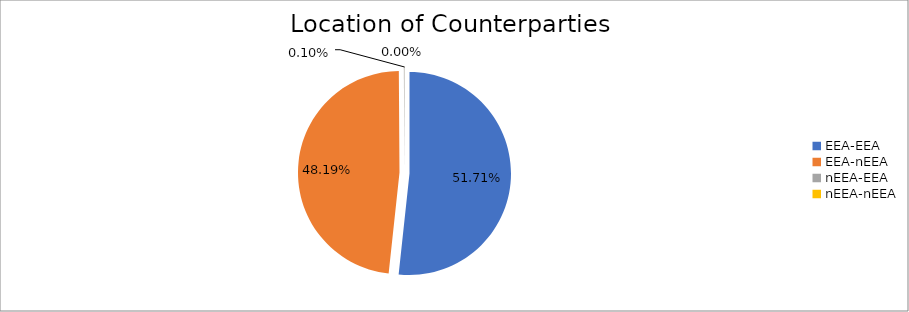
| Category | Series 0 |
|---|---|
| EEA-EEA | 5548973.678 |
| EEA-nEEA | 5171176.871 |
| nEEA-EEA | 10850.652 |
| nEEA-nEEA | 474.657 |